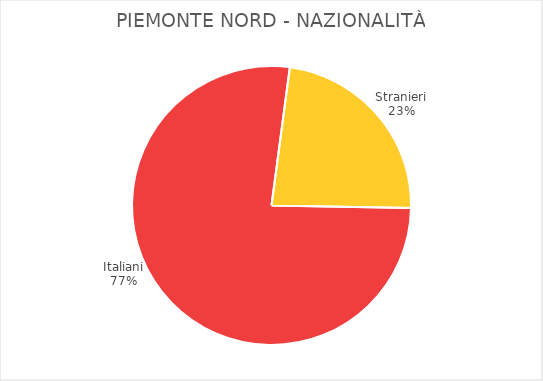
| Category | Piemonte Nord |
|---|---|
| Italiani | 18829 |
| Stranieri | 5680 |